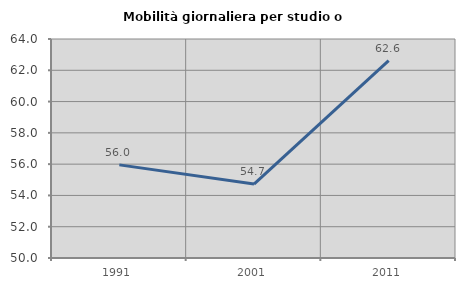
| Category | Mobilità giornaliera per studio o lavoro |
|---|---|
| 1991.0 | 55.954 |
| 2001.0 | 54.724 |
| 2011.0 | 62.621 |